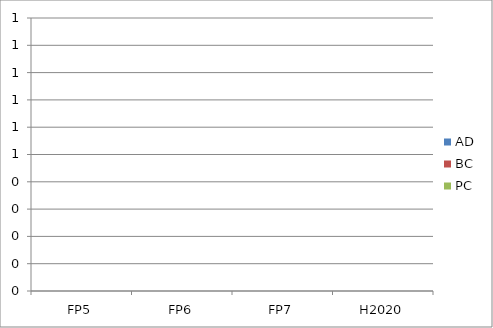
| Category | AD | BC | PC |
|---|---|---|---|
| FP5 | 0 | 0 | 0 |
| FP6 | 0 | 0 | 0 |
| FP7 | 0 | 0 | 0 |
| H2020 | 0 | 0 | 0 |